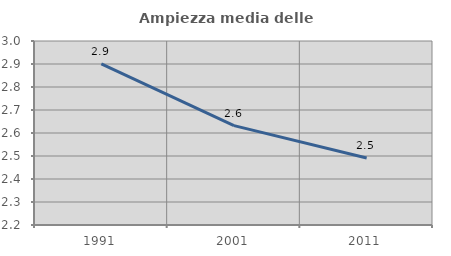
| Category | Ampiezza media delle famiglie |
|---|---|
| 1991.0 | 2.9 |
| 2001.0 | 2.632 |
| 2011.0 | 2.492 |